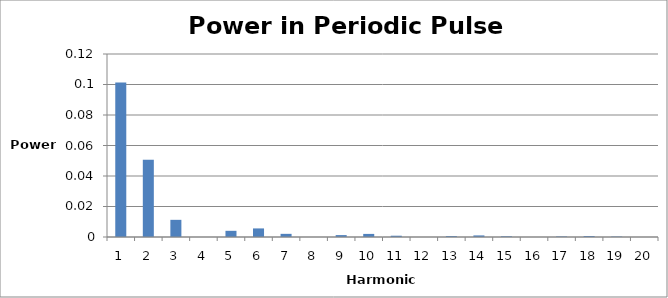
| Category | Series 0 |
|---|---|
| 0 | 0.101 |
| 1 | 0.051 |
| 2 | 0.011 |
| 3 | 0 |
| 4 | 0.004 |
| 5 | 0.006 |
| 6 | 0.002 |
| 7 | 0 |
| 8 | 0.001 |
| 9 | 0.002 |
| 10 | 0.001 |
| 11 | 0 |
| 12 | 0.001 |
| 13 | 0.001 |
| 14 | 0 |
| 15 | 0 |
| 16 | 0 |
| 17 | 0.001 |
| 18 | 0 |
| 19 | 0 |